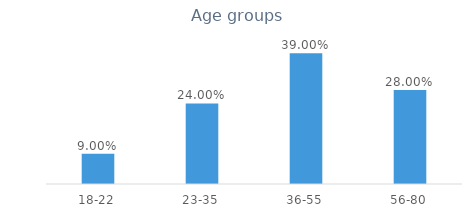
| Category | Series 0 |
|---|---|
| 18-22 | 0.09 |
| 23-35 | 0.24 |
| 36-55 | 0.39 |
| 56-80 | 0.28 |